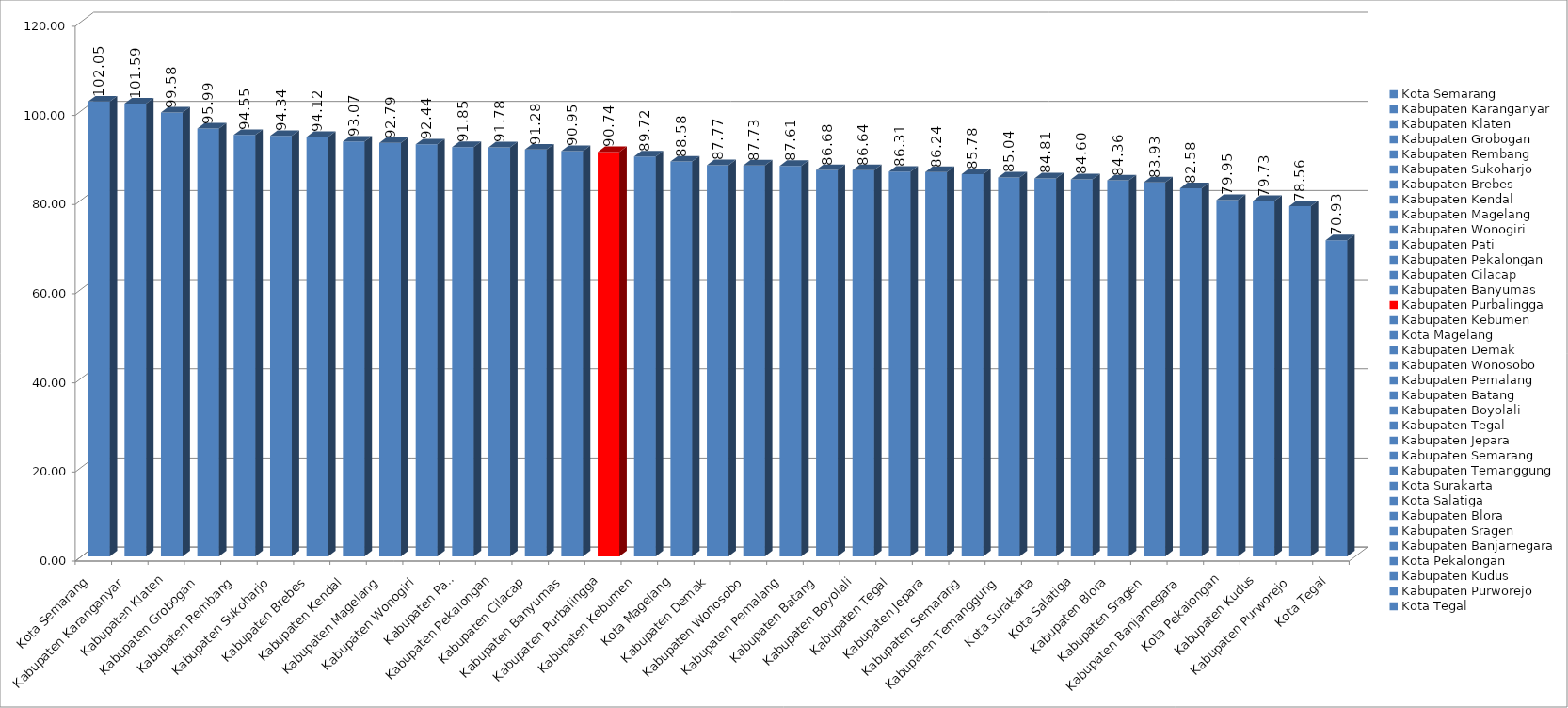
| Category | Series 0 |
|---|---|
| Kota Semarang | 102.05 |
| Kabupaten Karanganyar | 101.59 |
| Kabupaten Klaten | 99.58 |
| Kabupaten Grobogan | 95.99 |
| Kabupaten Rembang | 94.55 |
| Kabupaten Sukoharjo | 94.34 |
| Kabupaten Brebes | 94.12 |
| Kabupaten Kendal | 93.07 |
| Kabupaten Magelang | 92.79 |
| Kabupaten Wonogiri | 92.44 |
| Kabupaten Pati | 91.85 |
| Kabupaten Pekalongan | 91.78 |
| Kabupaten Cilacap | 91.28 |
| Kabupaten Banyumas | 90.95 |
| Kabupaten Purbalingga | 90.74 |
| Kabupaten Kebumen | 89.72 |
| Kota Magelang | 88.58 |
| Kabupaten Demak | 87.77 |
| Kabupaten Wonosobo | 87.73 |
| Kabupaten Pemalang | 87.61 |
| Kabupaten Batang | 86.68 |
| Kabupaten Boyolali | 86.64 |
| Kabupaten Tegal | 86.31 |
| Kabupaten Jepara | 86.24 |
| Kabupaten Semarang | 85.78 |
| Kabupaten Temanggung | 85.04 |
| Kota Surakarta | 84.81 |
| Kota Salatiga | 84.6 |
| Kabupaten Blora | 84.36 |
| Kabupaten Sragen | 83.93 |
| Kabupaten Banjarnegara | 82.58 |
| Kota Pekalongan | 79.95 |
| Kabupaten Kudus | 79.73 |
| Kabupaten Purworejo | 78.56 |
| Kota Tegal | 70.93 |